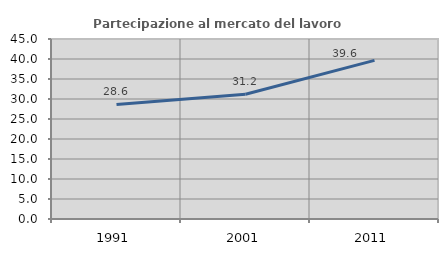
| Category | Partecipazione al mercato del lavoro  femminile |
|---|---|
| 1991.0 | 28.65 |
| 2001.0 | 31.186 |
| 2011.0 | 39.647 |